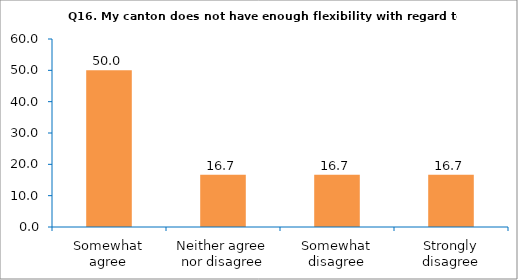
| Category | Series 0 |
|---|---|
| Somewhat agree | 50 |
| Neither agree nor disagree | 16.667 |
| Somewhat disagree | 16.667 |
| Strongly disagree | 16.667 |